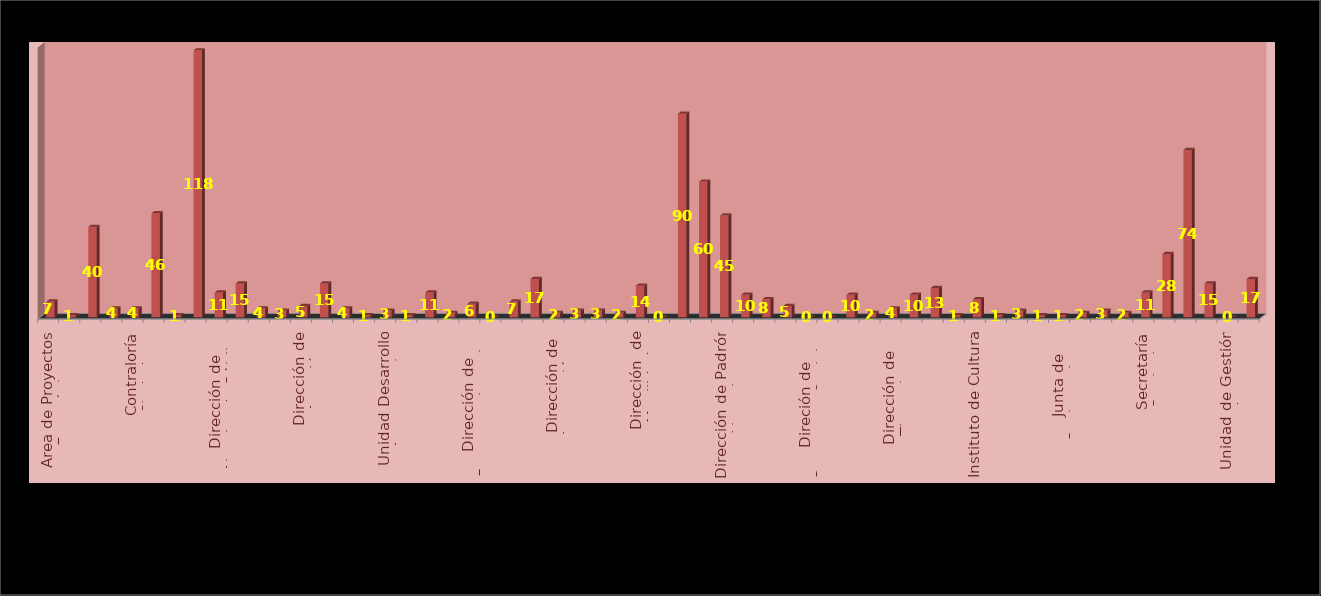
| Category | Series 0 | Series 1 |
|---|---|---|
| Area de Proyectos Estratégicos |  | 7 |
| Área de Relaciones Públicas |  | 1 |
| Comisaria de Seguridad Pública |  | 40 |
| Comunicación Social y Analisis Estratégico  |  | 4 |
| Contraloría Ciudadana |  | 4 |
| Coordinación General de Servicios Municipales |  | 46 |
| Coordinación de Desarrollo Económico Y Combate a la Desigualdad |  | 1 |
| Coordinación General de Administración e Innovación Gubernamental |  | 118 |
| Dirección de Alumbrado Público |  | 11 |
| Dirección de Archivo General Municipal  |  | 15 |
| Dirección de Aseo Público  |  | 4 |
| Dirección de Asuntos Internos |  | 3 |
| Dirección de Atención Ciudadana |  | 5 |
| Dirección de Catastro |  | 15 |
| Dirección de Cementerios |  | 4 |
| Dirección de Coplademun |  | 1 |
| Unidad Desarrollo Agropecuario |  | 3 |
| Dirección de Educación  |  | 1 |
| Dirección de Enlace con el ayuntamiento |  | 11 |
| Dirección de Delegaciones y Agencia M. |  | 2 |
| Dirección de Fomento al empleo y  emprendurismo         |  | 6 |
| Dirección de Gestión de Calidad |  | 0 |
| Dirección de Gestión Integral del Agua y Drenaje |  | 7 |
| Dirección de Inspección y Vigilancia |  | 17 |
| Dirección de Integración y Dictaminación |  | 2 |
| Dirección de Mantenimiento de Pavimentos  |  | 3 |
| Dirección de Mejoramiento Urbano |  | 3 |
| Dirección de Mercados  |  | 2 |
| Dirección  de Movilidad y Transporte |  | 14 |
| Dir. del Museo de Arte de Zapopan |  | 0 |
| Dirección de Obras Públicas e Infraestructura |  | 90 |
| Dirección de Ordenamiento del Territorio  |  | 60 |
| Dirección de Padrón y Licencias  |  | 45 |
| Dirección de Parques y Jardines  |  | 10 |
| Dirección de Participación Ciudadana |  | 8 |
| Dirección de Programas Sociales Municipales |  | 5 |
| Direción de Programas Sociales y Estrategicos |  | 0 |
| Dirección de Protección al Medio Ambiente  |  | 0 |
| Dirección de Protección Civil y Bomberos |  | 10 |
| Dirección de Rastros Municipales  |  | 2 |
| Dirección de Tianguis y Comercio en espacios Abiertos |  | 4 |
| Dirección General de Ecología |  | 10 |
| Dirección de Transparencia y Buenas Prácticas |  | 13 |
| Instituto de Capacitación y Oferta Educativa |  | 1 |
| Instituto de Cultura  |  | 8 |
| Intituto Municipal de la Juventud |  | 1 |
| Intituto Municipal de la Mujer |  | 3 |
| Jefatura de Gabinete |  | 1 |
| Junta de Reclutamiento |  | 1 |
| Regidor |  | 2 |
| Registro civil |  | 3 |
| Secretaría del Ayuntamiento |  | 2 |
| Secretaría Particular |  | 11 |
| Sindicatura Municipal |  | 28 |
| Tesorería Municipal |  | 74 |
| Unidad de Patrimonio Municipal  |  | 15 |
| Unidad de Gestión de Estacionamientos |  | 0 |
| Unidad de Protección  Animal  |  | 17 |